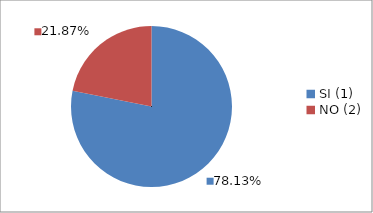
| Category | Series 0 |
|---|---|
| SI (1) | 0.781 |
| NO (2) | 0.219 |